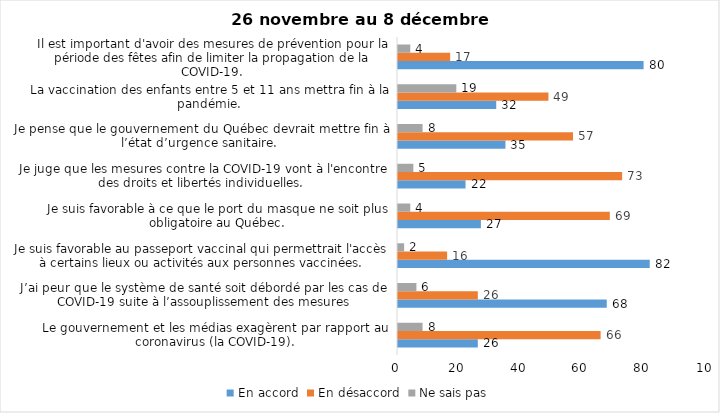
| Category | En accord | En désaccord | Ne sais pas |
|---|---|---|---|
| Le gouvernement et les médias exagèrent par rapport au coronavirus (la COVID-19). | 26 | 66 | 8 |
| J’ai peur que le système de santé soit débordé par les cas de COVID-19 suite à l’assouplissement des mesures | 68 | 26 | 6 |
| Je suis favorable au passeport vaccinal qui permettrait l'accès à certains lieux ou activités aux personnes vaccinées. | 82 | 16 | 2 |
| Je suis favorable à ce que le port du masque ne soit plus obligatoire au Québec. | 27 | 69 | 4 |
| Je juge que les mesures contre la COVID-19 vont à l'encontre des droits et libertés individuelles.  | 22 | 73 | 5 |
| Je pense que le gouvernement du Québec devrait mettre fin à l’état d’urgence sanitaire.  | 35 | 57 | 8 |
| La vaccination des enfants entre 5 et 11 ans mettra fin à la pandémie. | 32 | 49 | 19 |
| Il est important d'avoir des mesures de prévention pour la période des fêtes afin de limiter la propagation de la COVID-19. | 80 | 17 | 4 |